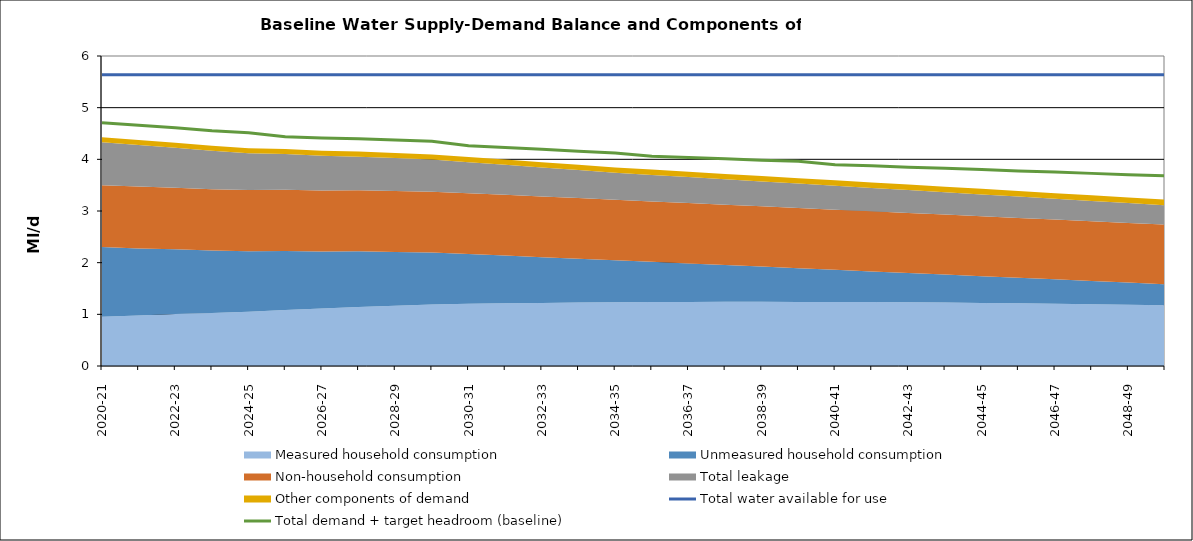
| Category | Total water available for use | Total demand + target headroom (baseline) |
|---|---|---|
| 0 | 5.639 | 4.708 |
| 1 | 5.639 | 4.658 |
| 2 | 5.639 | 4.613 |
| 3 | 5.639 | 4.553 |
| 4 | 5.639 | 4.516 |
| 5 | 5.639 | 4.437 |
| 6 | 5.639 | 4.411 |
| 7 | 5.639 | 4.399 |
| 8 | 5.639 | 4.375 |
| 9 | 5.639 | 4.35 |
| 10 | 5.639 | 4.261 |
| 11 | 5.639 | 4.228 |
| 12 | 5.639 | 4.194 |
| 13 | 5.639 | 4.157 |
| 14 | 5.639 | 4.124 |
| 15 | 5.639 | 4.061 |
| 16 | 5.639 | 4.035 |
| 17 | 5.639 | 4.011 |
| 18 | 5.639 | 3.984 |
| 19 | 5.639 | 3.962 |
| 20 | 5.639 | 3.895 |
| 21 | 5.639 | 3.875 |
| 22 | 5.639 | 3.848 |
| 23 | 5.639 | 3.826 |
| 24 | 5.639 | 3.801 |
| 25 | 5.639 | 3.776 |
| 26 | 5.639 | 3.752 |
| 27 | 5.639 | 3.728 |
| 28 | 5.639 | 3.703 |
| 29 | 5.639 | 3.684 |